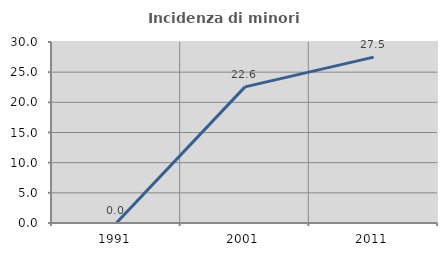
| Category | Incidenza di minori stranieri |
|---|---|
| 1991.0 | 0 |
| 2001.0 | 22.561 |
| 2011.0 | 27.491 |